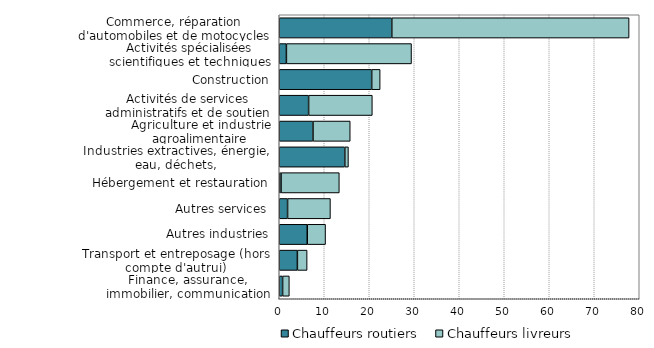
| Category | Chauffeurs routiers | Chauffeurs livreurs |
|---|---|---|
| Finance, assurance,
immobilier, communication | 0.744 | 1.498 |
| Transport et entreposage (hors compte d'autrui) | 4.029 | 2.165 |
| Autres industries | 6.224 | 4.067 |
| Autres services | 1.848 | 9.525 |
| Hébergement et restauration | 0.396 | 12.953 |
| Industries extractives, énergie, eau, déchets,
dépollution | 14.569 | 0.805 |
| Agriculture et industrie agroalimentaire | 7.499 | 8.274 |
| Activités de services administratifs et de soutien | 6.525 | 14.157 |
| Construction | 20.545 | 1.878 |
| Activités spécialisées scientifiques et techniques | 1.587 | 27.806 |
| Commerce, réparation d'automobiles et de motocycles | 25.007 | 52.738 |